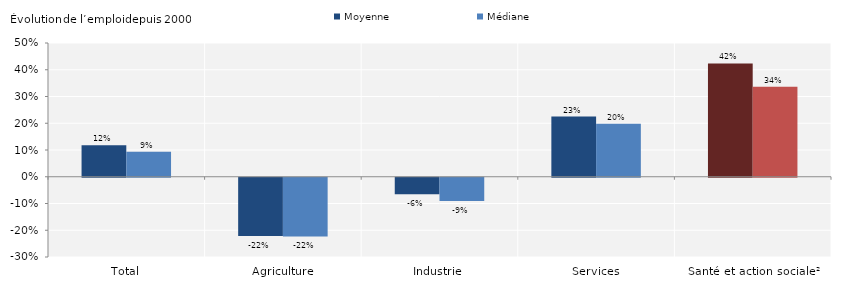
| Category | Moyenne | Médiane |
|---|---|---|
| Total | 0.117 | 0.094 |
| Agriculture | -0.218 | -0.219 |
| Industrie | -0.062 | -0.087 |
| Services | 0.225 | 0.198 |
| Santé et action sociale² | 0.423 | 0.337 |